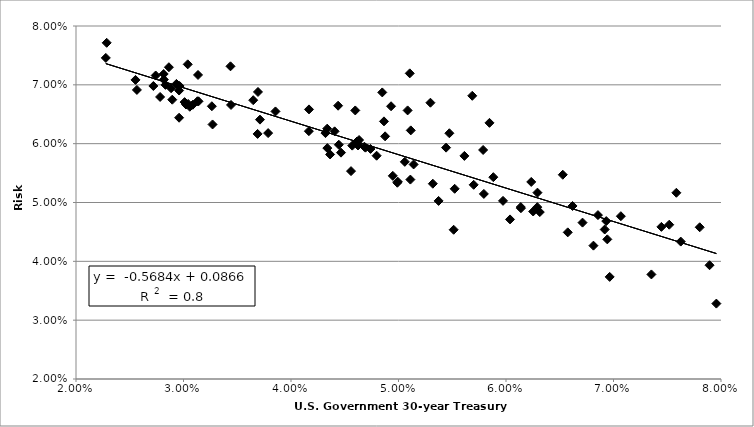
| Category | Series 0 |
|---|---|
| 0.07802062499999997 | 0.046 |
| 0.07893437499999999 | 0.039 |
| 0.07445446153846155 | 0.046 |
| 0.07518469696969694 | 0.046 |
| 0.07068396825396826 | 0.048 |
| 0.06855323076923074 | 0.048 |
| 0.06314272727272731 | 0.048 |
| 0.061389999999999986 | 0.049 |
| 0.06574515624999999 | 0.045 |
| 0.07352630769230767 | 0.038 |
| 0.07584772727272729 | 0.052 |
| 0.07956846153846153 | 0.033 |
| 0.0762572307692308 | 0.043 |
| 0.06942584615384617 | 0.044 |
| 0.06711861538461537 | 0.047 |
| 0.06234815384615382 | 0.053 |
| 0.06292569230769232 | 0.052 |
| 0.06918323076923079 | 0.045 |
| 0.06964469696969697 | 0.037 |
| 0.06619 | 0.049 |
| 0.06813328125000001 | 0.043 |
| 0.06932415384615384 | 0.047 |
| 0.06528166666666667 | 0.055 |
| 0.06137227272727274 | 0.049 |
| 0.05882015625000002 | 0.054 |
| 0.05846246153846155 | 0.064 |
| 0.05473196969696969 | 0.062 |
| 0.05104727272727275 | 0.072 |
| 0.05372968750000002 | 0.05 |
| 0.05794030769230768 | 0.051 |
| 0.060375606060606074 | 0.047 |
| 0.06252848484848486 | 0.048 |
| 0.06291261538461539 | 0.049 |
| 0.059723230769230765 | 0.05 |
| 0.05787187500000002 | 0.059 |
| 0.05686107692307691 | 0.068 |
| 0.054425937500000014 | 0.059 |
| 0.05699338461538464 | 0.053 |
| 0.05522562500000002 | 0.052 |
| 0.05297090909090909 | 0.067 |
| 0.0551321875 | 0.045 |
| 0.05612915384615385 | 0.058 |
| 0.0508485909090909 | 0.066 |
| 0.049307318181818195 | 0.066 |
| 0.048490953125 | 0.069 |
| 0.04597904615384617 | 0.066 |
| 0.051104863636363636 | 0.054 |
| 0.05114219696969698 | 0.062 |
| 0.048753138461538476 | 0.061 |
| 0.05319286153846153 | 0.053 |
| 0.05058801515151515 | 0.057 |
| 0.04864845454545455 | 0.064 |
| 0.046927312499999985 | 0.059 |
| 0.04465093846153847 | 0.058 |
| 0.044381742424242414 | 0.066 |
| 0.046829078125 | 0.059 |
| 0.04633183076923076 | 0.061 |
| 0.05140650769230769 | 0.056 |
| 0.0499256923076923 | 0.054 |
| 0.04739560000000001 | 0.059 |
| 0.047964107692307696 | 0.058 |
| 0.049891384615384615 | 0.053 |
| 0.04947043076923079 | 0.055 |
| 0.046137848484848476 | 0.06 |
| 0.044057984615384606 | 0.062 |
| 0.045697861538461525 | 0.06 |
| 0.04444857575757576 | 0.06 |
| 0.03648545454545455 | 0.067 |
| 0.034371828125000004 | 0.073 |
| 0.04167533846153845 | 0.066 |
| 0.043207924242424235 | 0.062 |
| 0.04336901515151515 | 0.063 |
| 0.04623328125000001 | 0.06 |
| 0.04363555384615385 | 0.058 |
| 0.03855463636363636 | 0.065 |
| 0.041662787878787896 | 0.062 |
| 0.04558379687499998 | 0.055 |
| 0.043380446153846154 | 0.059 |
| 0.03692825757575758 | 0.069 |
| 0.03039281538461539 | 0.073 |
| 0.03135133846153847 | 0.072 |
| 0.029340830769230764 | 0.07 |
| 0.02741293846153846 | 0.072 |
| 0.028642166666666666 | 0.073 |
| 0.031295609375 | 0.067 |
| 0.031398800000000004 | 0.067 |
| 0.0371136212121212 | 0.064 |
| 0.03787227272727271 | 0.062 |
| 0.03689290624999999 | 0.062 |
| 0.034420169230769224 | 0.067 |
| 0.032637651515151515 | 0.066 |
| 0.029634439393939404 | 0.07 |
| 0.025536187500000005 | 0.071 |
| 0.028846923076923076 | 0.069 |
| 0.029591227272727273 | 0.064 |
| 0.029592590909090898 | 0.069 |
| 0.0271972 | 0.07 |
| 0.025666046153846152 | 0.069 |
| 0.022773333333333333 | 0.075 |
| 0.028326507692307684 | 0.07 |
| 0.030435492307692304 | 0.067 |
| 0.02895535384615384 | 0.067 |
| 0.028157476923076918 | 0.072 |
| 0.028170630769230768 | 0.071 |
| 0.030233969230769233 | 0.067 |
| 0.030863630769230772 | 0.067 |
| 0.030584523076923074 | 0.066 |
| 0.03270189393939394 | 0.063 |
| 0.030102703124999998 | 0.067 |
| 0.027823599999999997 | 0.068 |
| 0.02285531818181818 | 0.077 |